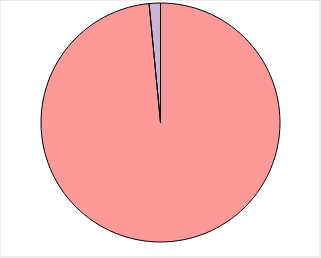
| Category | Ethanol plants |
|---|---|
| 0 | 14.981 |
| 1 | 0.232 |